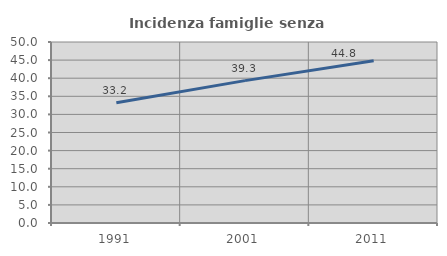
| Category | Incidenza famiglie senza nuclei |
|---|---|
| 1991.0 | 33.227 |
| 2001.0 | 39.33 |
| 2011.0 | 44.847 |